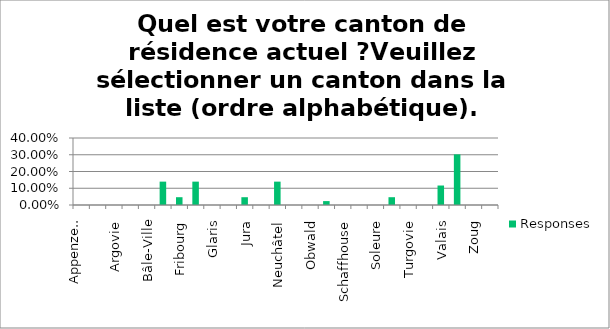
| Category | Responses |
|---|---|
| Appenzell Rh.-Ext. | 0 |
| Appenzell Rh.-Int. | 0 |
| Argovie | 0 |
| Bâle-Campagne | 0 |
| Bâle-Ville | 0 |
| Berne | 0.14 |
| Fribourg | 0.047 |
| Genève | 0.14 |
| Glaris | 0 |
| Grisons | 0 |
| Jura | 0.047 |
| Lucerne | 0 |
| Neuchâtel | 0.14 |
| Nidwald | 0 |
| Obwald | 0 |
| Saint-Gall | 0.023 |
| Schaffhouse | 0 |
| Schwyz | 0 |
| Soleure | 0 |
| Tessin | 0.047 |
| Turgovie | 0 |
| Uri | 0 |
| Valais | 0.116 |
| Vaud | 0.302 |
| Zoug | 0 |
| Zurich | 0 |